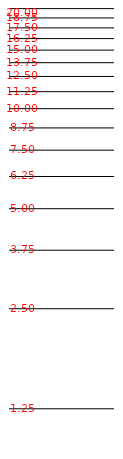
| Category | Series 0 |
|---|---|
| 0.0 | 0.223 |
| 0.0 | 0.916 |
| 0.0 | 1.322 |
| 0.0 | 1.609 |
| 0.0 | 1.833 |
| 0.0 | 2.015 |
| 0.0 | 2.169 |
| 0.0 | 2.303 |
| 0.0 | 2.42 |
| 0.0 | 2.526 |
| 0.0 | 2.621 |
| 0.0 | 2.708 |
| 0.0 | 2.788 |
| 0.0 | 2.862 |
| 0.0 | 2.931 |
| 0.0 | 2.996 |
| 0.0 | 3.056 |
| 0.0 | 3.114 |
| 0.0 | 3.168 |
| 0.0 | 3.219 |
| 0.0 | 3.268 |
| 0.0 | 3.314 |
| 0.0 | 3.359 |
| 0.0 | 3.401 |
| 0.0 | 3.442 |
| 0.0 | 3.481 |
| 0.0 | 3.519 |